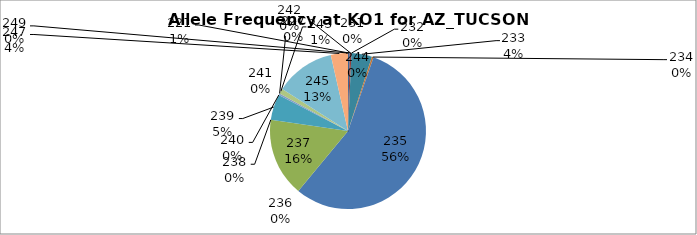
| Category | Series 0 |
|---|---|
| 221.0 | 0.004 |
| 227.0 | 0.004 |
| 231.0 | 0 |
| 232.0 | 0 |
| 233.0 | 0.043 |
| 234.0 | 0.004 |
| 235.0 | 0.557 |
| 236.0 | 0 |
| 237.0 | 0.163 |
| 238.0 | 0 |
| 239.0 | 0.053 |
| 240.0 | 0 |
| 241.0 | 0.004 |
| 242.0 | 0 |
| 243.0 | 0.011 |
| 244.0 | 0 |
| 245.0 | 0.124 |
| 247.0 | 0.035 |
| 249.0 | 0 |